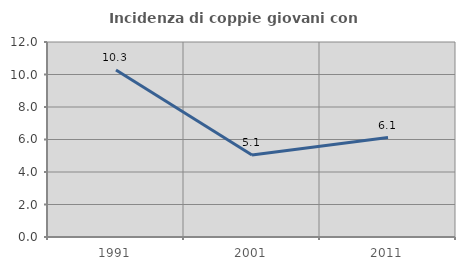
| Category | Incidenza di coppie giovani con figli |
|---|---|
| 1991.0 | 10.28 |
| 2001.0 | 5.051 |
| 2011.0 | 6.122 |